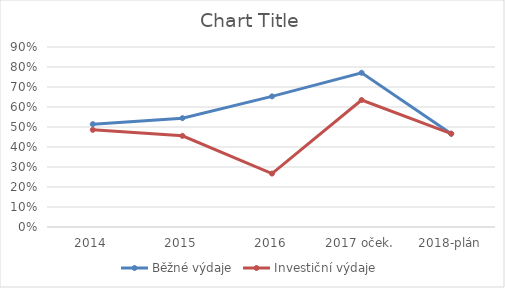
| Category | Běžné výdaje | Investiční výdaje  |
|---|---|---|
| 2014 | 0.514 | 0.486 |
| 2015 | 0.544 | 0.456 |
| 2016 | 0.653 | 0.267 |
| 2017 oček. | 0.771 | 0.635 |
| 2018-plán | 0.466 | 0.467 |